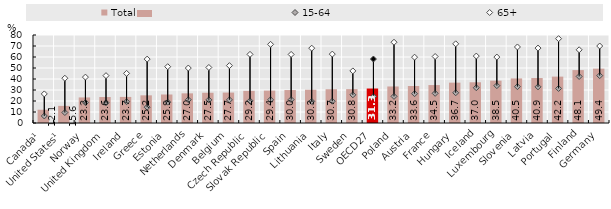
| Category | Total |
|---|---|
| 0 | 12.074 |
| 1 | 15.556 |
| 2 | 23.245 |
| 3 | 23.605 |
| 4 | 23.715 |
| 5 | 25.155 |
| 6 | 25.911 |
| 7 | 26.96 |
| 8 | 27.494 |
| 9 | 27.665 |
| 10 | 29.213 |
| 11 | 29.443 |
| 12 | 29.954 |
| 13 | 30.259 |
| 14 | 30.699 |
| 15 | 30.793 |
| 16 | 31.347 |
| 17 | 33.208 |
| 18 | 33.629 |
| 19 | 34.488 |
| 20 | 36.682 |
| 21 | 37.022 |
| 22 | 38.493 |
| 23 | 40.54 |
| 24 | 40.884 |
| 25 | 42.168 |
| 26 | 48.1 |
| 27 | 49.405 |